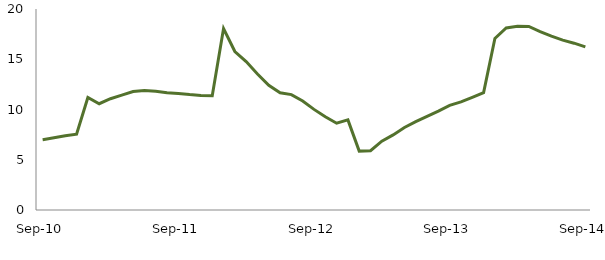
| Category | Series 0 |
|---|---|
| Sep-10 | 7 |
|  | 7.189 |
|  | 7.391 |
|  | 7.544 |
|  | 11.192 |
|  | 10.576 |
|  | 11.074 |
|  | 11.424 |
|  | 11.795 |
|  | 11.884 |
|  | 11.821 |
|  | 11.67 |
| Sep-11 | 11.588 |
|  | 11.481 |
|  | 11.403 |
|  | 11.374 |
|  | 18.05 |
|  | 15.769 |
|  | 14.767 |
|  | 13.533 |
|  | 12.403 |
|  | 11.663 |
|  | 11.484 |
|  | 10.846 |
| Sep-12 | 10.011 |
|  | 9.276 |
|  | 8.633 |
|  | 8.963 |
|  | 5.86 |
|  | 5.902 |
|  | 6.851 |
|  | 7.471 |
|  | 8.212 |
|  | 8.796 |
|  | 9.326 |
|  | 9.847 |
| Sep-13 | 10.415 |
|  | 10.762 |
|  | 11.207 |
|  | 11.678 |
|  | 17.072 |
|  | 18.112 |
|  | 18.284 |
|  | 18.263 |
|  | 17.75 |
|  | 17.299 |
|  | 16.908 |
|  | 16.599 |
| Sep-14 | 16.228 |